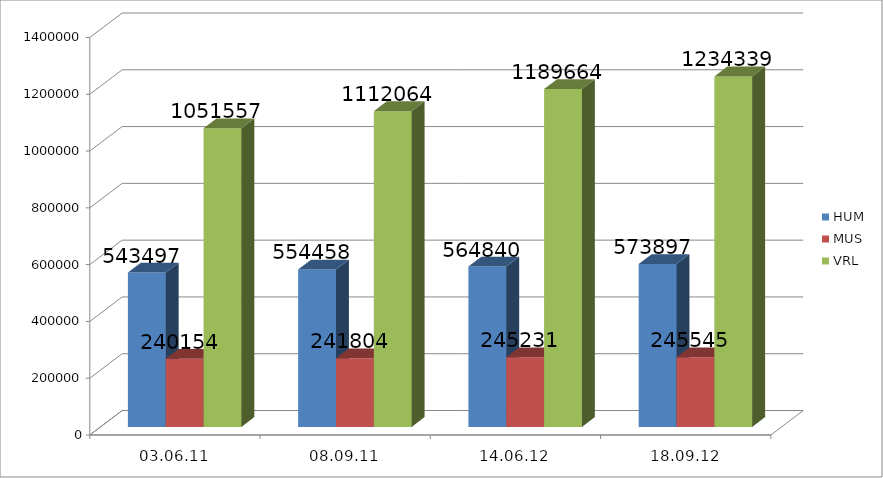
| Category | HUM | MUS | VRL |
|---|---|---|---|
| 03.06.11 | 543497 | 240154 | 1051557 |
| 08.09.11 | 554458 | 241804 | 1112064 |
| 14.06.12 | 564840 | 245231 | 1189664 |
| 18.09.12 | 573897 | 245545 | 1234339 |